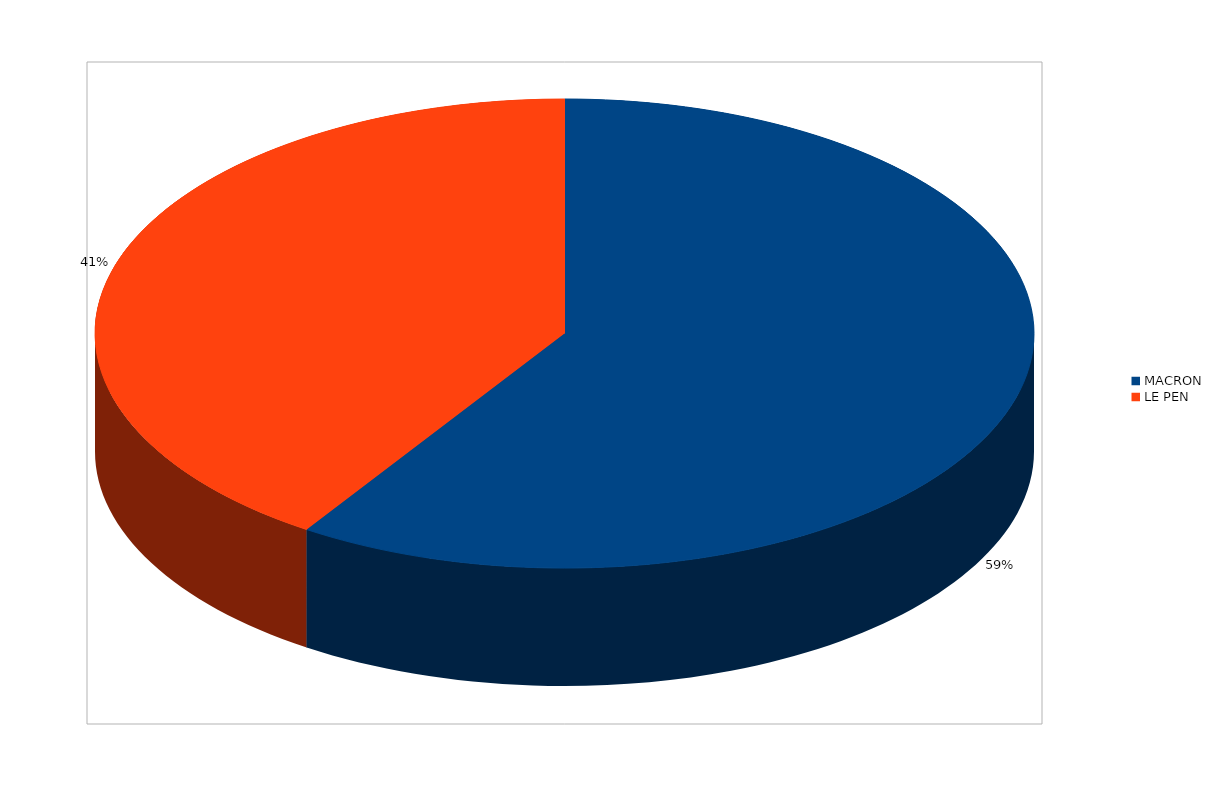
| Category | Series 0 |
|---|---|
| MACRON | 5018 |
| LE PEN | 3451 |